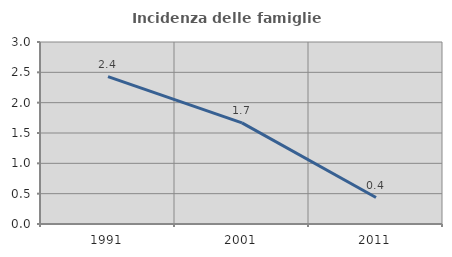
| Category | Incidenza delle famiglie numerose |
|---|---|
| 1991.0 | 2.429 |
| 2001.0 | 1.667 |
| 2011.0 | 0.437 |